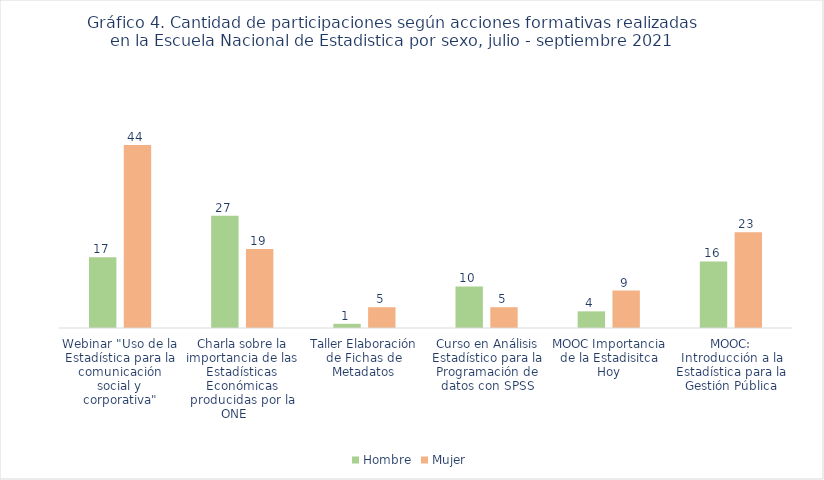
| Category | Hombre | Mujer |
|---|---|---|
| Webinar "Uso de la Estadística para la comunicación social y corporativa" | 17 | 44 |
| Charla sobre la importancia de las Estadísticas Económicas producidas por la ONE     | 27 | 19 |
| Taller Elaboración de Fichas de Metadatos | 1 | 5 |
| Curso en Análisis Estadístico para la Programación de datos con SPSS | 10 | 5 |
| MOOC Importancia de la Estadisitca Hoy | 4 | 9 |
| MOOC: Introducción a la Estadística para la Gestión Pública | 16 | 23 |